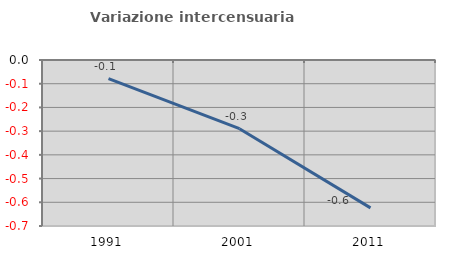
| Category | Variazione intercensuaria annua |
|---|---|
| 1991.0 | -0.078 |
| 2001.0 | -0.29 |
| 2011.0 | -0.623 |